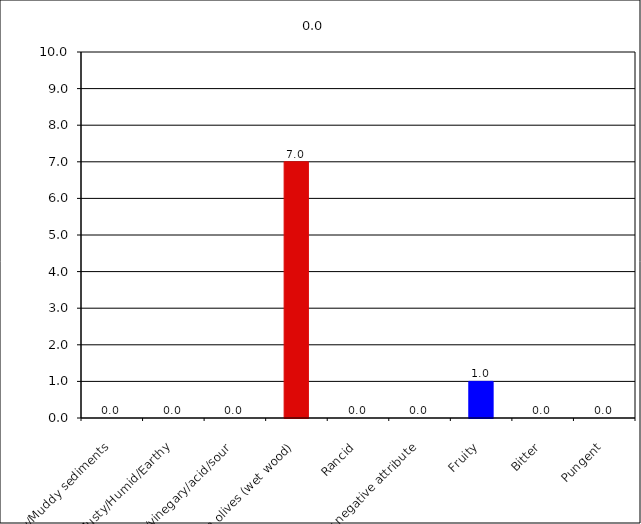
| Category | 0.0 |
|---|---|
| Fusty/Muddy sediments | 0 |
| Musty/Humid/Earthy | 0 |
| Winey/vinegary/acid/sour | 0 |
| Frostbitten olives (wet wood) | 7 |
| Rancid | 0 |
| Other negative attribute | 0 |
| Fruity | 1 |
| Bitter | 0 |
| Pungent | 0 |